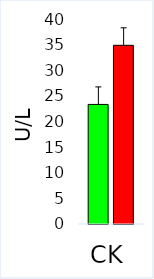
| Category | Control | ASD |
|---|---|---|
| CK | 23.331 | 34.868 |